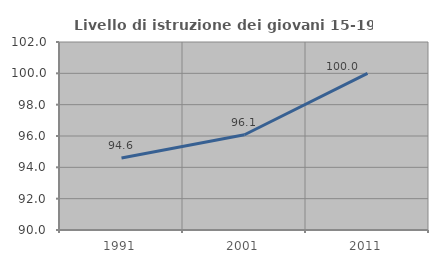
| Category | Livello di istruzione dei giovani 15-19 anni |
|---|---|
| 1991.0 | 94.595 |
| 2001.0 | 96.078 |
| 2011.0 | 100 |